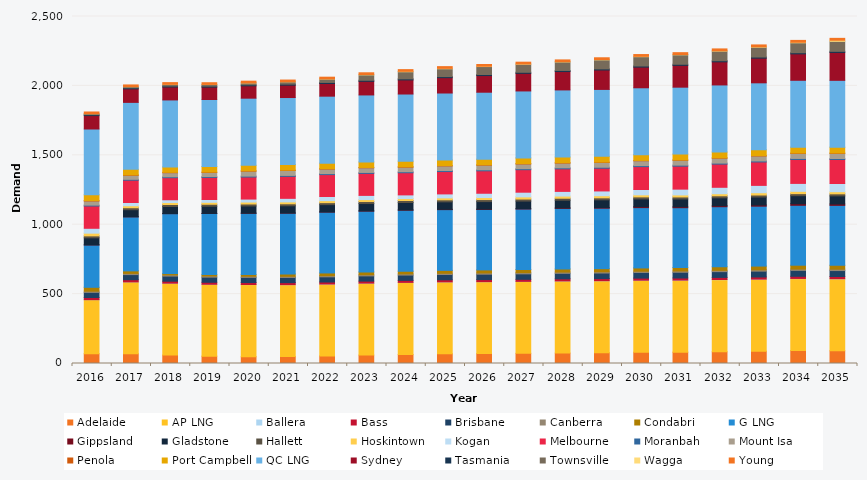
| Category | Adelaide | AP LNG | Ballera | Bass | Brisbane | Canberra | Condabri | G LNG | Gippsland | Gladstone | Hallett | Hoskintown | Kogan | Melbourne | Moranbah | Mount Isa | Penola | Port Campbell | QC LNG | Sydney | Tasmania | Townsville | Wagga | Young |
|---|---|---|---|---|---|---|---|---|---|---|---|---|---|---|---|---|---|---|---|---|---|---|---|---|
| 2016.0 | 71.129 | 388.69 | 0.045 | 15.578 | 36.933 | 8.598 | 28.035 | 305.178 | 0.634 | 50.675 | 13.995 | 19.499 | 35.181 | 160.387 | 6.45 | 29.764 | 2.673 | 42.031 | 474.034 | 96.404 | 7.082 | 6.702 | 0.295 | 12.098 |
| 2017.0 | 70.104 | 517.774 | 0.099 | 15.681 | 36.877 | 8.674 | 18.121 | 389.235 | 0.682 | 50.776 | 14.162 | 14.294 | 23.243 | 160.756 | 6.443 | 29.052 | 2.701 | 40.117 | 482.502 | 97.571 | 7.202 | 8.388 | 0.303 | 12.197 |
| 2018.0 | 60.737 | 517.774 | 0.201 | 14.18 | 36.972 | 8.682 | 9.489 | 431.486 | 0.735 | 50.9 | 14.329 | 14.015 | 20.175 | 159.01 | 6.444 | 29.368 | 2.748 | 39.168 | 482.502 | 93.057 | 7.205 | 11.841 | 0.394 | 12.236 |
| 2019.0 | 52.836 | 517.774 | 0.207 | 14.241 | 37.081 | 8.65 | 9.599 | 440.174 | 0.717 | 51.836 | 14.205 | 13.908 | 20.395 | 158.801 | 6.455 | 29.61 | 2.597 | 40.401 | 482.502 | 89.18 | 7.293 | 11.909 | 0.328 | 12.226 |
| 2020.0 | 49.491 | 519.159 | 0.294 | 14.299 | 37.184 | 8.576 | 11.919 | 441.353 | 0.734 | 52.105 | 14.17 | 13.876 | 21.56 | 158.664 | 6.642 | 35.522 | 2.571 | 39.677 | 483.793 | 89.06 | 7.375 | 13.513 | 0.385 | 12.185 |
| 2021.0 | 49.871 | 517.792 | 0.599 | 14.325 | 37.27 | 8.48 | 16.32 | 438.63 | 0.8 | 52.372 | 14.18 | 13.608 | 25.646 | 158.406 | 6.823 | 35.424 | 2.588 | 40.55 | 482.474 | 89.134 | 7.453 | 16.818 | 0.514 | 12.121 |
| 2022.0 | 54.075 | 517.822 | 0.807 | 14.34 | 37.486 | 8.449 | 19.363 | 438.63 | 0.914 | 52.713 | 14.21 | 14.487 | 29.949 | 157.685 | 7.011 | 32.911 | 2.604 | 40.119 | 482.43 | 91.46 | 7.526 | 24.478 | 1.2 | 12.121 |
| 2023.0 | 60.611 | 517.851 | 0.645 | 14.376 | 37.799 | 8.493 | 19.937 | 438.279 | 1.41 | 53.109 | 14.392 | 14.105 | 30.148 | 158.37 | 7.046 | 33.176 | 2.683 | 40.014 | 482.386 | 98.107 | 7.595 | 38.825 | 2.941 | 12.183 |
| 2024.0 | 64.665 | 519.267 | 0.45 | 14.485 | 38.191 | 8.587 | 19.563 | 439.452 | 1.634 | 53.523 | 14.448 | 14.006 | 26.523 | 159.628 | 7.084 | 32.959 | 2.686 | 40.742 | 483.633 | 101.496 | 7.66 | 51.2 | 3.118 | 12.289 |
| 2025.0 | 69.77 | 517.911 | 0.506 | 14.589 | 38.594 | 8.685 | 20.959 | 437.571 | 2.216 | 53.926 | 14.428 | 14.067 | 28.651 | 161.109 | 7.122 | 33.262 | 2.62 | 40.472 | 482.298 | 110.487 | 7.721 | 56.461 | 3 | 12.4 |
| 2026.0 | 71.237 | 517.94 | 0.585 | 14.685 | 38.985 | 8.783 | 22.082 | 435.47 | 2.394 | 54.332 | 14.436 | 14.617 | 31.025 | 161.613 | 7.159 | 33.546 | 2.66 | 40.693 | 482.255 | 119.913 | 7.779 | 57.248 | 2.25 | 12.511 |
| 2027.0 | 73.061 | 517.97 | 0.703 | 14.781 | 39.392 | 8.878 | 22.715 | 435.47 | 2.625 | 54.772 | 14.456 | 15.557 | 33.803 | 162.16 | 7.199 | 33.856 | 2.654 | 41.38 | 482.211 | 126.692 | 7.833 | 58.081 | 2.058 | 12.618 |
| 2028.0 | 74.897 | 519.385 | 0.681 | 14.875 | 39.803 | 8.968 | 22.258 | 436.636 | 3.678 | 55.181 | 14.383 | 15.563 | 33.626 | 162.436 | 7.24 | 34.163 | 2.568 | 41.194 | 483.457 | 132.354 | 7.883 | 61.34 | 1.991 | 12.72 |
| 2029.0 | 77.927 | 518.029 | 0.715 | 14.964 | 40.226 | 9.058 | 22.448 | 435.47 | 4.65 | 55.639 | 14.408 | 15.306 | 34.311 | 163.634 | 7.282 | 34.465 | 2.561 | 41.494 | 482.123 | 139.765 | 7.929 | 65.042 | 2.389 | 12.822 |
| 2030.0 | 81.215 | 518.058 | 0.845 | 15.061 | 40.665 | 9.155 | 23.556 | 434.501 | 6.69 | 56.128 | 14.459 | 14.861 | 38.239 | 164.922 | 7.327 | 34.782 | 2.542 | 41.402 | 482.079 | 148.87 | 7.973 | 67.044 | 2.597 | 12.931 |
| 2031.0 | 81.888 | 518.088 | 0.964 | 15.17 | 41.11 | 9.258 | 24.339 | 431.623 | 6.405 | 56.588 | 14.448 | 14.67 | 41.66 | 165.52 | 7.373 | 35.102 | 2.527 | 42.04 | 482.035 | 157.062 | 8.02 | 68.029 | 2.444 | 13.044 |
| 2032.0 | 84.377 | 519.504 | 1.098 | 15.288 | 41.569 | 9.37 | 25.527 | 432.778 | 7.114 | 57.088 | 14.505 | 14.857 | 46.404 | 166.837 | 7.422 | 35.437 | 2.545 | 41.912 | 483.281 | 166.308 | 8.066 | 69.499 | 2.509 | 13.165 |
| 2033.0 | 88.555 | 518.147 | 1.269 | 15.405 | 42.043 | 9.486 | 26.939 | 431.623 | 8.365 | 57.616 | 14.522 | 16.432 | 52.832 | 168.578 | 7.472 | 35.784 | 2.548 | 42.596 | 481.947 | 177.695 | 8.111 | 70.922 | 3.026 | 13.292 |
| 2034.0 | 93.184 | 518.177 | 1.382 | 15.522 | 42.517 | 9.601 | 27.852 | 431.623 | 11.051 | 58.124 | 14.626 | 16.673 | 57.195 | 172.33 | 7.539 | 36.132 | 2.588 | 42.383 | 481.903 | 190.333 | 8.155 | 71.664 | 3.853 | 13.418 |
| 2035.0 | 91.448 | 518.206 | 1.436 | 15.639 | 42.99 | 9.711 | 28.287 | 431.623 | 9.77 | 58.621 | 14.679 | 15.345 | 59.165 | 172.599 | 7.606 | 36.483 | 2.604 | 42.463 | 481.453 | 200.742 | 8.197 | 71.929 | 8.035 | 13.536 |